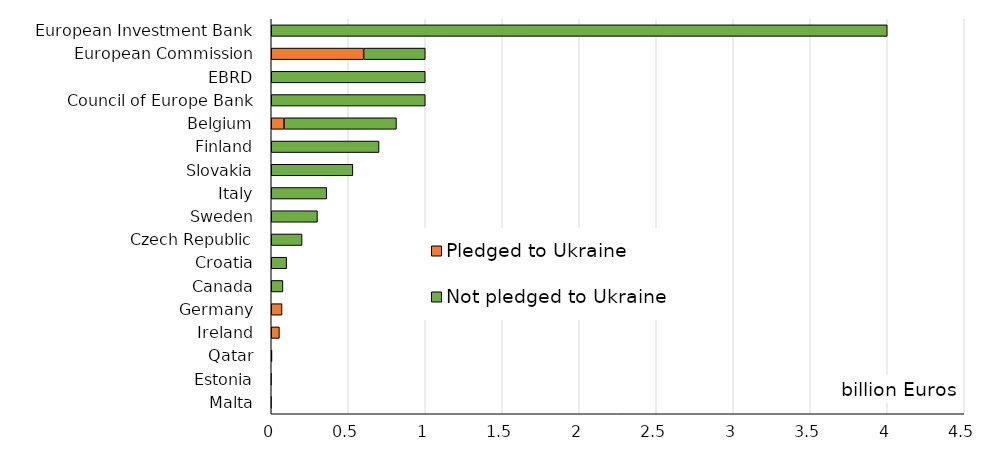
| Category | Pledged to Ukraine | Not pledged to Ukraine |
|---|---|---|
| European Investment Bank | 0 | 4 |
| European Commission | 0.6 | 0.4 |
| EBRD | 0 | 1 |
| Council of Europe Bank | 0 | 1 |
| Belgium | 0.083 | 0.73 |
| Finland | 0 | 0.7 |
| Slovakia | 0 | 0.53 |
| Italy | 0 | 0.36 |
| Sweden | 0 | 0.3 |
| Czech Republic | 0 | 0.2 |
| Croatia | 0 | 0.1 |
| Canada | 0 | 0.076 |
| Germany | 0.07 | 0 |
| Ireland | 0.053 | 0 |
| Qatar | 0 | 0.005 |
| Estonia | 0 | 0 |
| Malta | 0 | 0 |